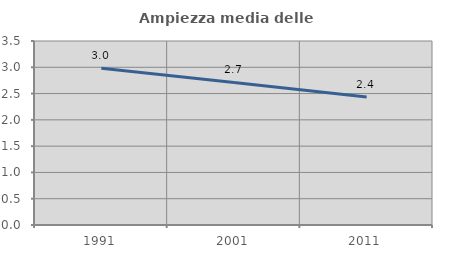
| Category | Ampiezza media delle famiglie |
|---|---|
| 1991.0 | 2.984 |
| 2001.0 | 2.711 |
| 2011.0 | 2.433 |